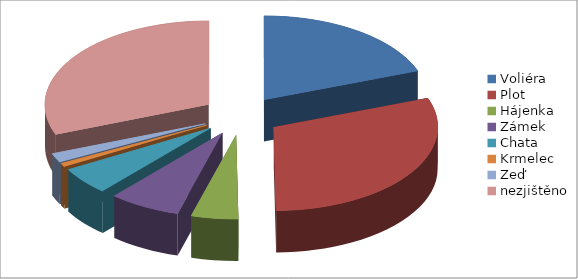
| Category | Hlavní druhy staveb |
|---|---|
| Voliéra | 88 |
| Plot | 138 |
| Hájenka | 21 |
| Zámek | 32 |
| Chata | 24 |
| Krmelec | 3 |
| Zeď | 8 |
| nezjištěno | 140 |